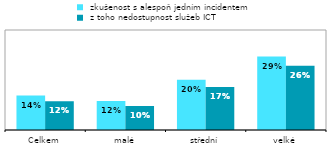
| Category |  zkušenost s alespoň jedním incidentem |  z toho nedostupnost služeb ICT |
|---|---|---|
| Celkem | 0.138 | 0.115 |
| malé | 0.116 | 0.096 |
| střední | 0.201 | 0.172 |
| velké | 0.294 | 0.257 |